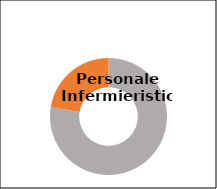
| Category | Series 1 |
|---|---|
| Donne  | 0.775 |
| Uomini  | 0.225 |